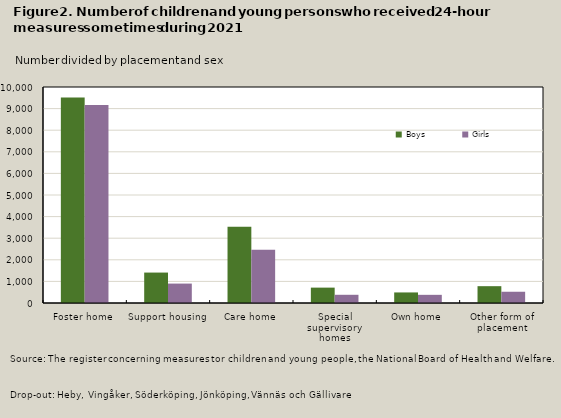
| Category | Boys | Girls |
|---|---|---|
| Foster home | 9515 | 9168 |
| Support housing | 1409 | 899 |
| Care home | 3530 | 2463 |
| Special supervisory homes | 712 | 380 |
| Own home | 489 | 378 |
| Other form of placement | 779 | 521 |